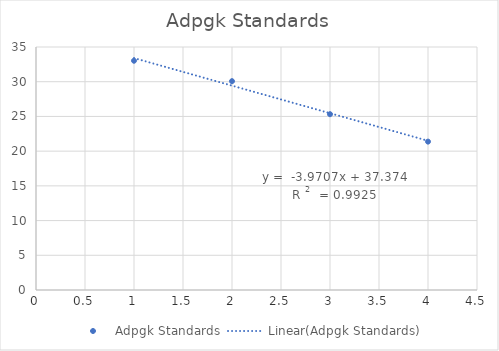
| Category | Adpgk Standards |
|---|---|
| 4.0 | 21.371 |
| 3.0 | 25.32 |
| 2.0 | 30.077 |
| 1.0 | 33.021 |